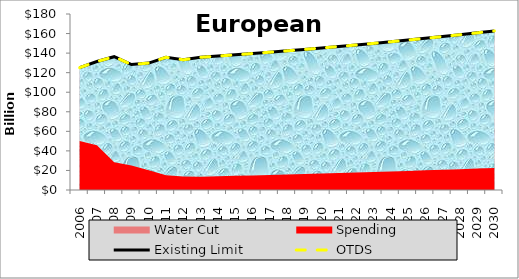
| Category | Existing Limit | OTDS |
|---|---|---|
| 0 | 125135495795.588 | 125135495795.588 |
| 1 | 131395538795.588 | 131395538795.588 |
| 2 | 136316061795.588 | 136316061795.588 |
| 3 | 128273123795.588 | 128273123795.588 |
| 4 | 129824164795.588 | 129824164795.588 |
| 5 | 135701684795.588 | 135701684795.588 |
| 6 | 133145876795.588 | 133145876795.588 |
| 7 | 135721475795.588 | 135721475795.588 |
| 8 | 136961809085.588 | 136961809085.588 |
| 9 | 138239352374.288 | 138239352374.288 |
| 10 | 139555221961.649 | 139555221961.649 |
| 11 | 140910567636.631 | 140910567636.631 |
| 12 | 142306573681.862 | 142306573681.862 |
| 13 | 143744459908.45 | 143744459908.45 |
| 14 | 145225482721.836 | 145225482721.836 |
| 15 | 146750936219.624 | 146750936219.624 |
| 16 | 148322153322.345 | 148322153322.345 |
| 17 | 149940506938.148 | 149940506938.148 |
| 18 | 151607411162.424 | 151607411162.424 |
| 19 | 153324322513.429 | 153324322513.429 |
| 20 | 155092741204.965 | 155092741204.965 |
| 21 | 156914212457.246 | 156914212457.246 |
| 22 | 158790327847.096 | 158790327847.096 |
| 23 | 160722726698.641 | 160722726698.641 |
| 24 | 162713097515.732 | 162713097515.732 |